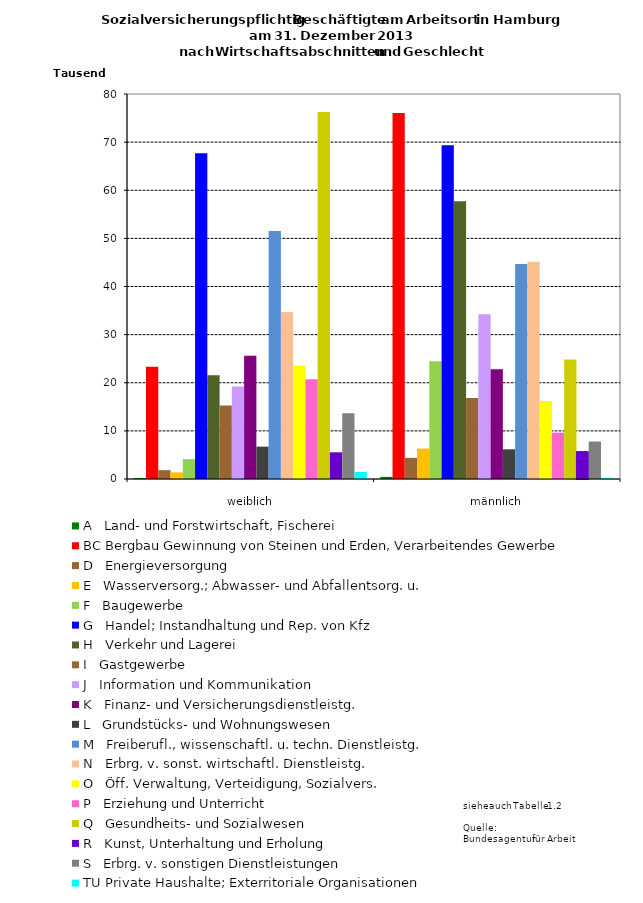
| Category | A   Land- und Forstwirtschaft, Fischerei | BC Bergbau Gewinnung von Steinen und Erden, Verarbeitendes Gewerbe | D   Energieversorgung | E   Wasserversorg.; Abwasser- und Abfallentsorg. u. | F   Baugewerbe | G   Handel; Instandhaltung und Rep. von Kfz | H   Verkehr und Lagerei | I   Gastgewerbe | J   Information und Kommunikation | K   Finanz- und Versicherungsdienstleistg. | L   Grundstücks- und Wohnungswesen | M   Freiberufl., wissenschaftl. u. techn. Dienstleistg. | N   Erbrg. v. sonst. wirtschaftl. Dienstleistg. | O   Öff. Verwaltung, Verteidigung, Sozialvers. | P   Erziehung und Unterricht | Q   Gesundheits- und Sozialwesen | R   Kunst, Unterhaltung und Erholung | S   Erbrg. v. sonstigen Dienstleistungen | TU Private Haushalte; Exterritoriale Organisationen |
|---|---|---|---|---|---|---|---|---|---|---|---|---|---|---|---|---|---|---|---|
| weiblich | 216 | 23339 | 1840 | 1374 | 4122 | 67693 | 21564 | 15255 | 19225 | 25629 | 6727 | 51512 | 34687 | 23510 | 20738 | 76261 | 5549 | 13687 | 1462 |
| männlich | 446 | 76076 | 4401 | 6328 | 24485 | 69364 | 57705 | 16829 | 34225 | 22797 | 6172 | 44682 | 45150 | 16192 | 9633 | 24819 | 5692 | 7791 | 242 |